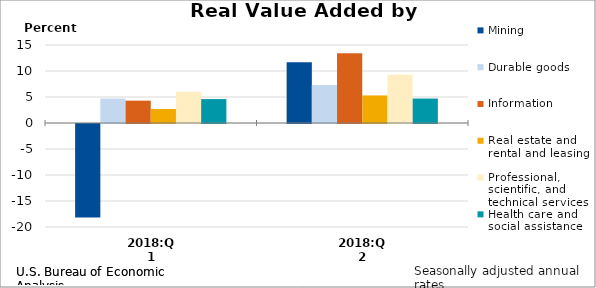
| Category | Mining | Durable goods | Information | Real estate and rental and leasing | Professional, scientific, and technical services | Health care and social assistance |
|---|---|---|---|---|---|---|
| 2018:Q1 | -18 | 4.7 | 4.3 | 2.7 | 6 | 4.6 |
| 2018:Q2 | 11.7 | 7.3 | 13.4 | 5.3 | 9.3 | 4.7 |